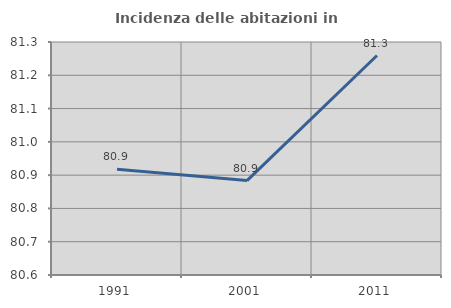
| Category | Incidenza delle abitazioni in proprietà  |
|---|---|
| 1991.0 | 80.918 |
| 2001.0 | 80.884 |
| 2011.0 | 81.259 |